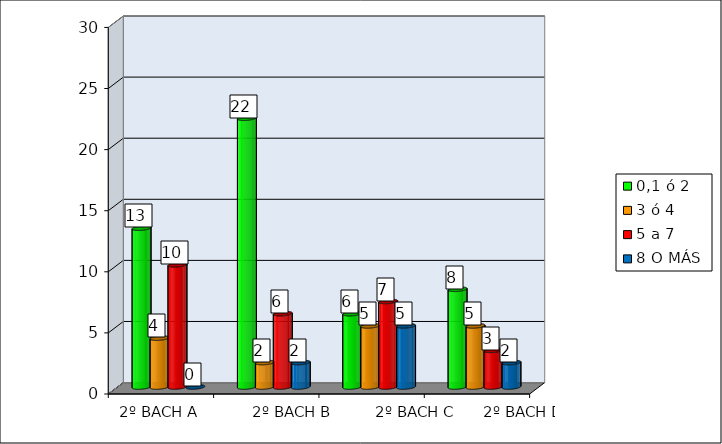
| Category | 0,1 ó 2  | 3 ó 4 | 5 a 7 | 8 O MÁS |
|---|---|---|---|---|
|  | 13 | 4 | 10 | 0 |
|  | 22 | 2 | 6 | 2 |
|  | 6 | 5 | 7 | 5 |
|  | 8 | 5 | 3 | 2 |